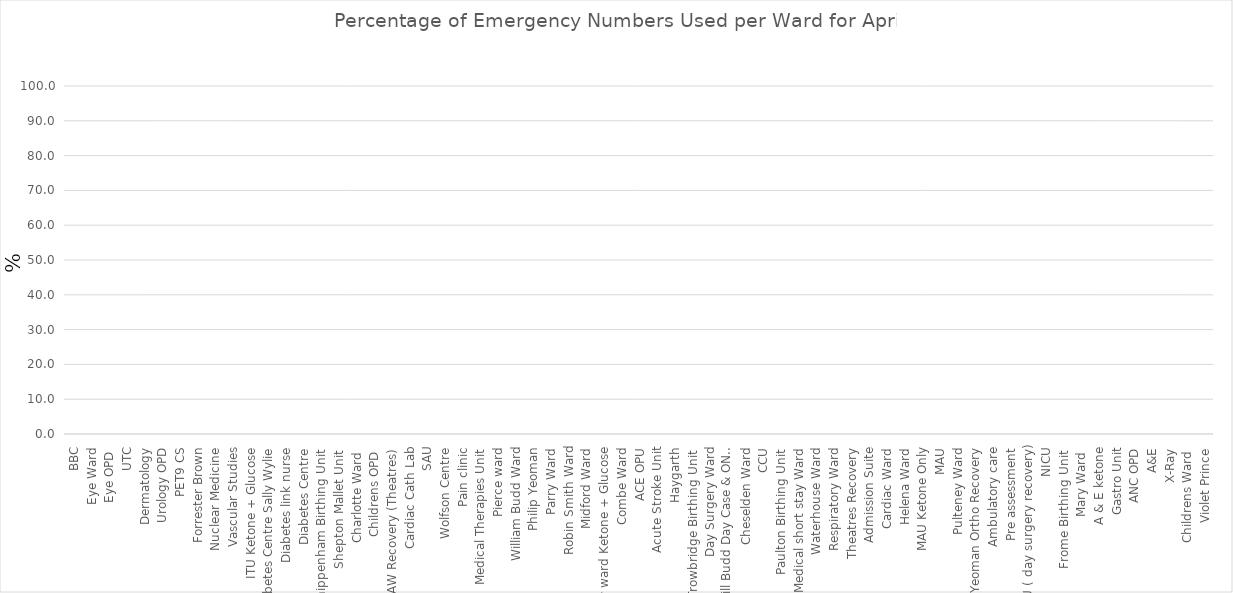
| Category | Series 0 |
|---|---|
| BBC | 0 |
| Eye Ward | 0 |
| Eye OPD  | 0 |
| UTC | 0 |
| Dermatology | 0 |
| Urology OPD | 0 |
| PET9 CS | 0 |
| Forrester Brown | 0 |
| Nuclear Medicine | 0 |
| Vascular Studies | 0 |
| ITU Ketone + Glucose | 0 |
| Diabetes Centre Sally Wylie | 0 |
| Diabetes link nurse | 0 |
| Diabetes Centre | 0 |
| Chippenham Birthing Unit  | 0 |
| Shepton Mallet Unit  | 0 |
| Charlotte Ward  | 0 |
| Childrens OPD  | 0 |
| PAW Recovery (Theatres) | 0 |
| Cardiac Cath Lab | 0 |
| SAU | 0 |
| Wolfson Centre | 0 |
| Pain clinic | 0 |
| Medical Therapies Unit | 0 |
| Pierce ward | 0 |
| William Budd Ward | 0 |
| Philip Yeoman | 0 |
| Parry Ward | 0 |
| Robin Smith Ward | 0 |
| Midford Ward | 0 |
| Parry ward Ketone + Glucose | 0 |
| Combe Ward | 0 |
| ACE OPU | 0 |
| Acute Stroke Unit | 0 |
| Haygarth | 0 |
| Trowbridge Birthing Unit  | 0 |
| Day Surgery Ward | 0 |
| Will Budd Day Case & ONC OPD | 0 |
| Cheselden Ward | 0 |
| CCU | 0 |
| Paulton Birthing Unit  | 0 |
| Medical short stay Ward | 0 |
| Waterhouse Ward | 0 |
| Respiratory Ward | 0 |
| Theatres Recovery | 0 |
| Admission Suite | 0 |
| Cardiac Ward | 0 |
| Helena Ward | 0 |
| MAU Ketone Only | 0 |
| MAU | 0 |
| Pulteney Ward | 0 |
| Philip Yeoman Ortho Recovery | 0 |
| Ambulatory care | 0 |
| Pre assessment | 0 |
| SSSU ( day surgery recovery) | 0 |
| NICU | 0 |
| Frome Birthing Unit  | 0 |
| Mary Ward  | 0 |
| A & E ketone | 0 |
| Gastro Unit | 0 |
| ANC OPD | 0 |
| A&E | 0 |
| X-Ray | 0 |
| Childrens Ward  | 0 |
| Violet Prince | 0 |